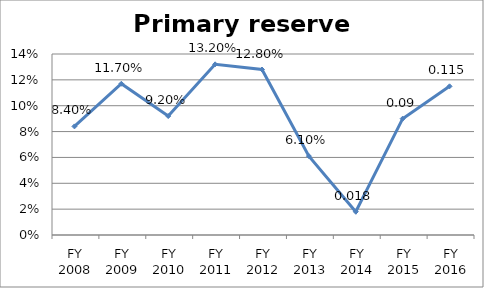
| Category | Primary reserve ratio |
|---|---|
| FY 2016 | 0.115 |
| FY 2015 | 0.09 |
| FY 2014 | 0.018 |
| FY 2013 | 0.061 |
| FY 2012 | 0.128 |
| FY 2011 | 0.132 |
| FY 2010 | 0.092 |
| FY 2009 | 0.117 |
| FY 2008 | 0.084 |